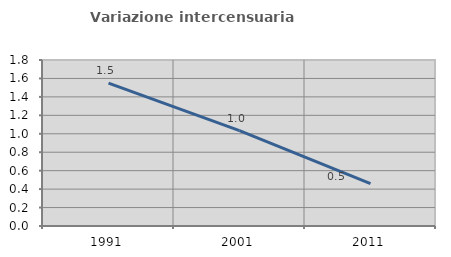
| Category | Variazione intercensuaria annua |
|---|---|
| 1991.0 | 1.548 |
| 2001.0 | 1.034 |
| 2011.0 | 0.459 |